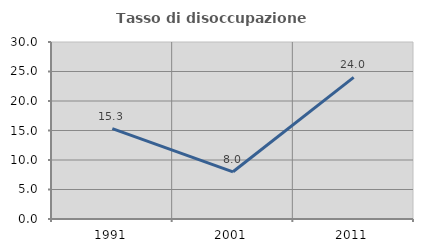
| Category | Tasso di disoccupazione giovanile  |
|---|---|
| 1991.0 | 15.315 |
| 2001.0 | 8 |
| 2011.0 | 24 |